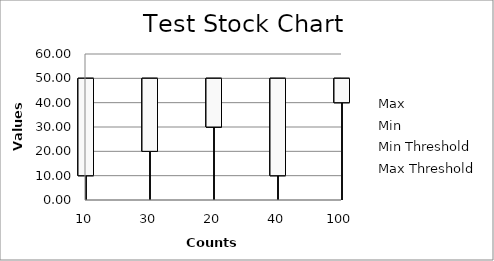
| Category | Max | Min | Min Threshold | Max Threshold |
|---|---|---|---|---|
| 10 | 10 | 5 | 0 | 50 |
| 30 | 20 | 10 | 0 | 50 |
| 20 | 30 | 15 | 0 | 50 |
| 40 | 10 | 0 | 0 | 50 |
| 100 | 40 | 5 | 0 | 50 |